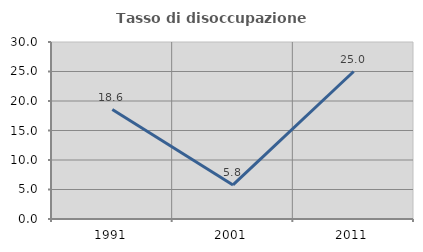
| Category | Tasso di disoccupazione giovanile  |
|---|---|
| 1991.0 | 18.557 |
| 2001.0 | 5.769 |
| 2011.0 | 25 |